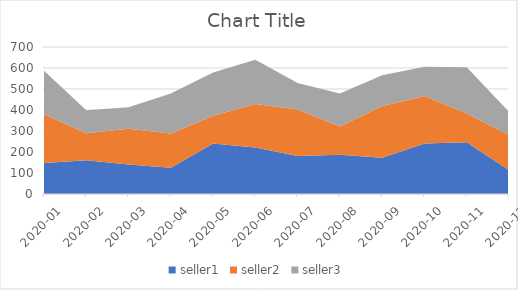
| Category | seller1 | seller2 | seller3 |
|---|---|---|---|
| 2020-01 | 148 | 232 | 207 |
| 2020-02 | 161 | 128 | 110 |
| 2020-03 | 141 | 170 | 102 |
| 2020-04 | 125 | 163 | 190 |
| 2020-05 | 241 | 132 | 206 |
| 2020-06 | 221 | 207 | 211 |
| 2020-07 | 181 | 221 | 127 |
| 2020-08 | 187 | 134 | 158 |
| 2020-09 | 173 | 246 | 146 |
| 2020-10 | 240 | 227 | 139 |
| 2020-11 | 247 | 136 | 220 |
| 2020-12 | 113 | 168 | 111 |